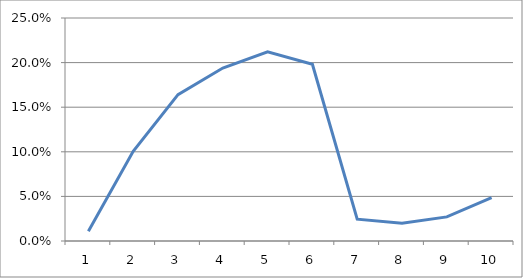
| Category | Series 0 |
|---|---|
| 0 | 0.011 |
| 1 | 0.101 |
| 2 | 0.164 |
| 3 | 0.194 |
| 4 | 0.212 |
| 5 | 0.198 |
| 6 | 0.024 |
| 7 | 0.02 |
| 8 | 0.027 |
| 9 | 0.049 |